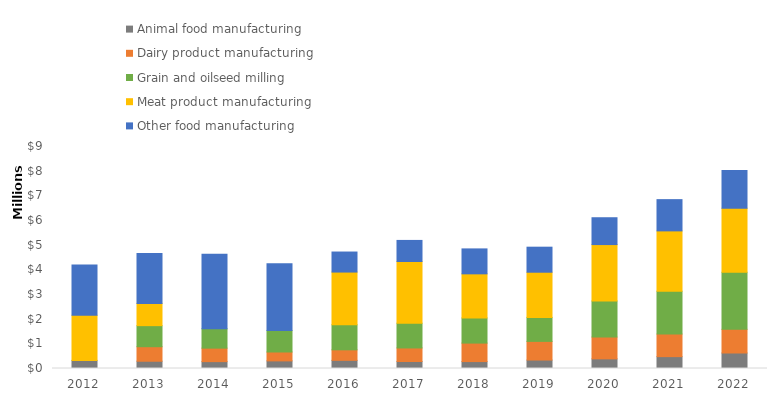
| Category | Animal food manufacturing  | Dairy product manufacturing  | Grain and oilseed milling  | Meat product manufacturing  | Other food manufacturing |
|---|---|---|---|---|---|
| 2012 | 328450 | 0 | 0 | 1830787 | 2039695 |
| 2013 | 294539 | 588847 | 853857 | 902648 | 2017850 |
| 2014 | 278633 | 546957 | 787430 | 0 | 3014795 |
| 2015 | 308248 | 360876 | 868814 | 0 | 2706580 |
| 2016 | 330683 | 426203 | 1018439 | 2134310 | 812337 |
| 2017 | 284377 | 548548 | 1002933 | 2502673 | 853973 |
| 2018 | 281030 | 748936 | 1020188 | 1787168 | 1011307 |
| 2019 | 342894 | 756093 | 973172 | 1831193 | 1015065 |
| 2020 | 391344 | 882282 | 1462943 | 2287355 | 1088212 |
| 2021 | 481199 | 913945 | 1737839 | 2445863 | 1267055 |
| 2022 | 628574 | 958433 | 2313167 | 2597685 | 1524252 |